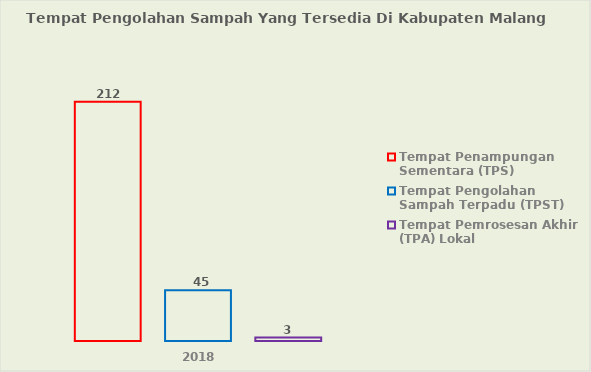
| Category | Tempat Penampungan Sementara (TPS) | Tempat Pengolahan Sampah Terpadu (TPST) | Tempat Pemrosesan Akhir (TPA) Lokal |
|---|---|---|---|
| 2018.0 | 212 | 45 | 3 |